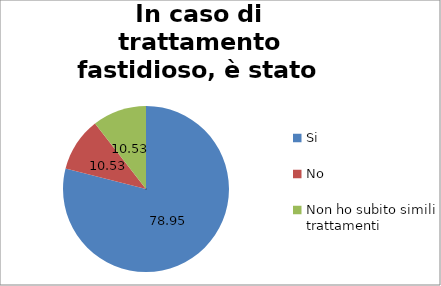
| Category | In caso di trattamento fastidioso, è stato avvertito in anticipo? |
|---|---|
| Si | 78.947 |
| No | 10.526 |
| Non ho subito simili trattamenti | 10.526 |